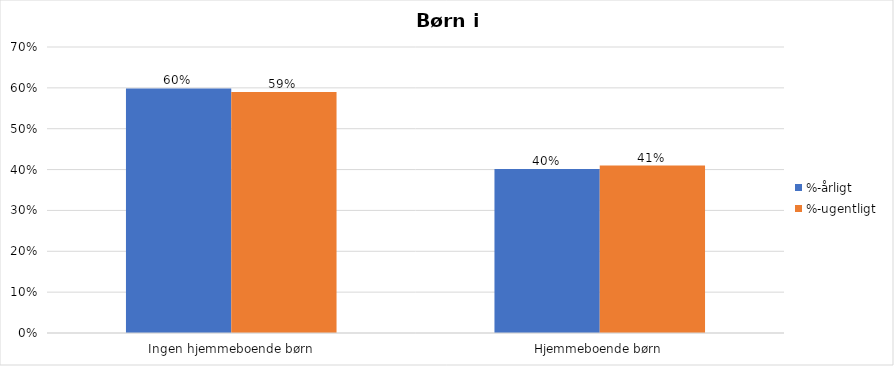
| Category | %-årligt | %-ugentligt |
|---|---|---|
| Ingen hjemmeboende børn | 0.599 | 0.59 |
| Hjemmeboende børn | 0.401 | 0.41 |